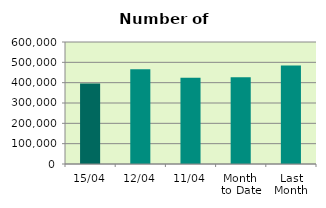
| Category | Series 0 |
|---|---|
| 15/04 | 396280 |
| 12/04 | 466118 |
| 11/04 | 423772 |
| Month 
to Date | 426571.455 |
| Last
Month | 483948.286 |